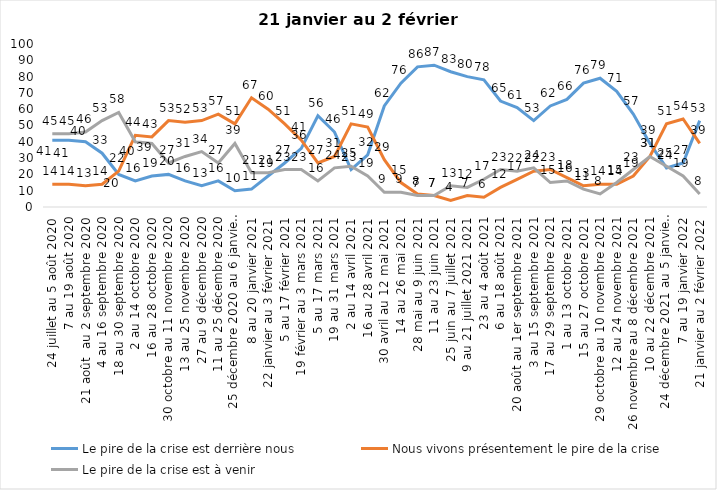
| Category | Le pire de la crise est derrière nous | Nous vivons présentement le pire de la crise | Le pire de la crise est à venir |
|---|---|---|---|
| 24 juillet au 5 août 2020 | 41 | 14 | 45 |
| 7 au 19 août 2020 | 41 | 14 | 45 |
| 21 août  au 2 septembre 2020 | 40 | 13 | 46 |
| 4 au 16 septembre 2020 | 33 | 14 | 53 |
| 18 au 30 septembre 2020 | 20 | 22 | 58 |
| 2 au 14 octobre 2020 | 16 | 44 | 40 |
| 16 au 28 octobre 2020 | 19 | 43 | 39 |
| 30 octobre au 11 novembre 2020 | 20 | 53 | 27 |
| 13 au 25 novembre 2020 | 16 | 52 | 31 |
| 27 au 9 décembre 2020 | 13 | 53 | 34 |
| 11 au 25 décembre 2020 | 16 | 57 | 27 |
| 25 décembre 2020 au 6 janvier 2021 | 10 | 51 | 39 |
| 8 au 20 janvier 2021 | 11 | 67 | 21 |
| 22 janvier au 3 février 2021 | 19 | 60 | 21 |
| 5 au 17 février 2021 | 27 | 51 | 23 |
| 19 février au 3 mars 2021 | 36 | 41 | 23 |
| 5 au 17 mars 2021 | 56 | 27 | 16 |
| 19 au 31 mars 2021 | 46 | 31 | 24 |
| 2 au 14 avril 2021 | 23 | 51 | 25 |
| 16 au 28 avril 2021 | 32 | 49 | 19 |
| 30 avril au 12 mai 2021 | 62 | 29 | 9 |
| 14 au 26 mai 2021 | 76 | 15 | 9 |
| 28 mai au 9 juin 2021 | 86 | 8 | 7 |
| 11 au 23 juin 2021 | 87 | 7 | 7 |
| 25 juin au 7 juillet 2021 | 83 | 4 | 13 |
| 9 au 21 juillet 2021 2021 | 80 | 7 | 12 |
| 23 au 4 août 2021 | 78 | 6 | 17 |
| 6 au 18 août 2021 | 65 | 12 | 23 |
| 20 août au 1er septembre 2021 | 61 | 17 | 22 |
| 3 au 15 septembre 2021 | 53 | 22 | 24 |
| 17 au 29 septembre 2021 | 62 | 23 | 15 |
| 1 au 13 octobre 2021 | 66 | 18 | 16 |
| 15 au 27 octobre 2021 | 76 | 13 | 11 |
| 29 octobre au 10 novembre 2021 | 79 | 14 | 8 |
| 12 au 24 novembre 2021 | 71 | 14 | 15 |
| 26 novembre au 8 décembre 2021 | 57 | 19 | 23 |
| 10 au 22 décembre 2021 | 39 | 31 | 31 |
| 24 décembre 2021 au 5 janvier 2022 2022 | 24 | 51 | 25 |
| 7 au 19 janvier 2022 | 27 | 54 | 19 |
| 21 janvier au 2 février 2022 | 53 | 39 | 8 |